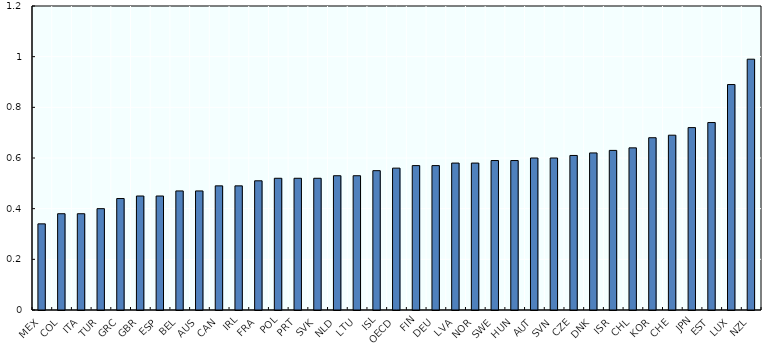
| Category | Series 0 |
|---|---|
| MEX | 0.34 |
| COL | 0.38 |
| ITA | 0.38 |
| TUR | 0.4 |
| GRC | 0.44 |
| GBR | 0.45 |
| ESP | 0.45 |
| BEL | 0.47 |
| AUS | 0.47 |
| CAN | 0.49 |
| IRL | 0.49 |
| FRA | 0.51 |
| POL | 0.52 |
| PRT | 0.52 |
| SVK | 0.52 |
| NLD | 0.53 |
| LTU | 0.53 |
| ISL | 0.55 |
| OECD | 0.56 |
| FIN | 0.57 |
| DEU | 0.57 |
| LVA | 0.58 |
| NOR | 0.58 |
| SWE | 0.59 |
| HUN | 0.59 |
| AUT | 0.6 |
| SVN | 0.6 |
| CZE | 0.61 |
| DNK | 0.62 |
| ISR | 0.63 |
| CHL | 0.64 |
| KOR | 0.68 |
| CHE | 0.69 |
| JPN | 0.72 |
| EST | 0.74 |
| LUX | 0.89 |
| NZL | 0.99 |